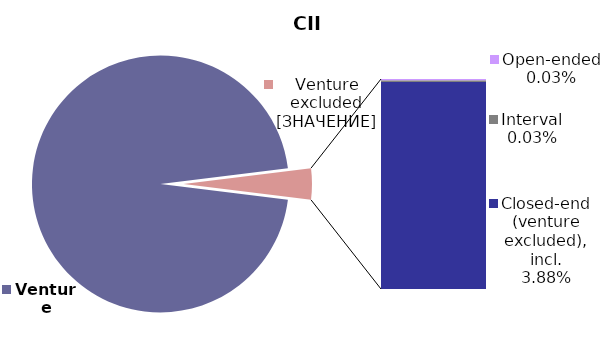
| Category | CII NAV Breakdown |
|---|---|
| Venture | 0.961 |
| Open-ended | 0 |
| Interval | 0 |
| Closed-end (venture excluded), incl. | 0.039 |